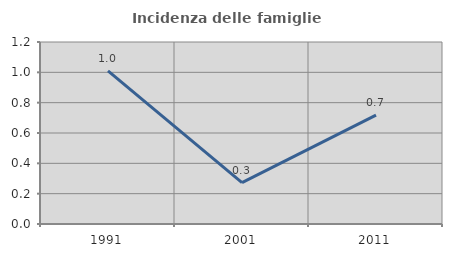
| Category | Incidenza delle famiglie numerose |
|---|---|
| 1991.0 | 1.009 |
| 2001.0 | 0.272 |
| 2011.0 | 0.718 |